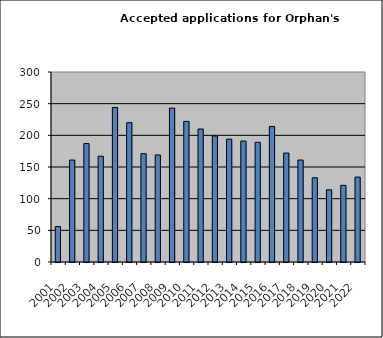
| Category | Series 1 |
|---|---|
| 2001.0 | 56 |
| 2002.0 | 161 |
| 2003.0 | 187 |
| 2004.0 | 167 |
| 2005.0 | 244 |
| 2006.0 | 220 |
| 2007.0 | 171 |
| 2008.0 | 169 |
| 2009.0 | 243 |
| 2010.0 | 222 |
| 2011.0 | 210 |
| 2012.0 | 199 |
| 2013.0 | 194 |
| 2014.0 | 191 |
| 2015.0 | 189 |
| 2016.0 | 214 |
| 2017.0 | 172 |
| 2018.0 | 161 |
| 2019.0 | 133 |
| 2020.0 | 114 |
| 2021.0 | 121 |
| 2022.0 | 134 |